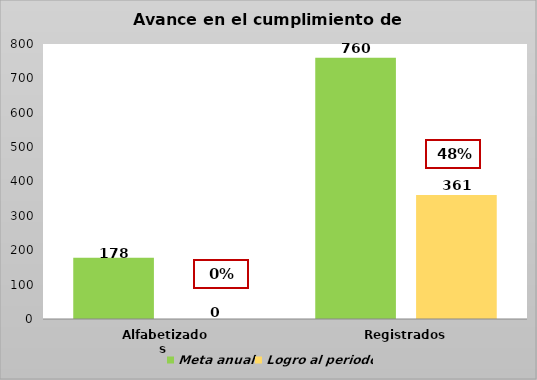
| Category | Meta anual | Logro al periodo |
|---|---|---|
| Alfabetizados  | 178 | 0 |
| Registrados | 760 | 361 |